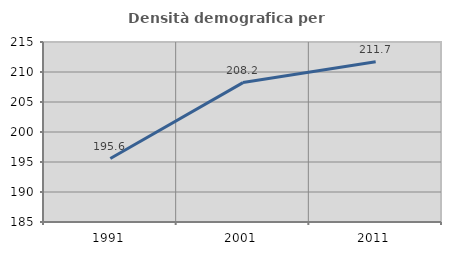
| Category | Densità demografica |
|---|---|
| 1991.0 | 195.572 |
| 2001.0 | 208.236 |
| 2011.0 | 211.721 |